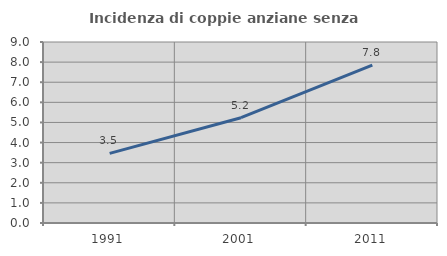
| Category | Incidenza di coppie anziane senza figli  |
|---|---|
| 1991.0 | 3.461 |
| 2001.0 | 5.236 |
| 2011.0 | 7.849 |